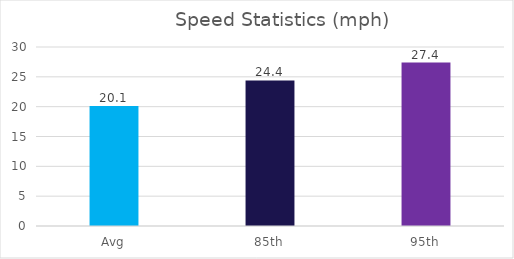
| Category | Series 0 |
|---|---|
| Avg | 20.1 |
| 85th | 24.4 |
| 95th | 27.4 |